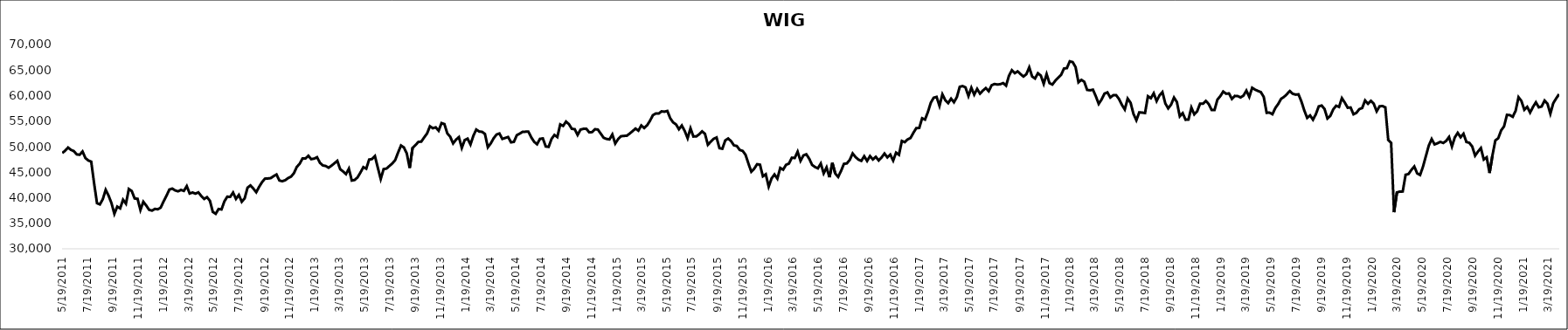
| Category | WIG |
|---|---|
| 5/19/11 | 48747.55 |
| 5/26/11 | 49215.53 |
| 6/2/11 | 49824.93 |
| 6/9/11 | 49378.82 |
| 6/16/11 | 49129.21 |
| 6/23/11 | 48485.26 |
| 6/30/11 | 48414.36 |
| 7/7/11 | 49057.05 |
| 7/14/11 | 47768.38 |
| 7/21/11 | 47291.31 |
| 7/28/11 | 47071.4 |
| 8/4/11 | 42828.22 |
| 8/11/11 | 38934.71 |
| 8/18/11 | 38697.56 |
| 8/25/11 | 39715.27 |
| 9/1/11 | 41553.09 |
| 9/8/11 | 40405.17 |
| 9/15/11 | 38945 |
| 9/22/11 | 36851.2 |
| 9/29/11 | 38264.32 |
| 10/6/11 | 37915.03 |
| 10/13/11 | 39608.13 |
| 10/20/11 | 38835.92 |
| 10/27/11 | 41708.88 |
| 11/3/11 | 41313.92 |
| 11/10/11 | 39853.18 |
| 11/17/11 | 39797.19 |
| 11/24/11 | 37607.27 |
| 12/1/11 | 39215.21 |
| 12/8/11 | 38474.28 |
| 12/15/11 | 37637.47 |
| 12/22/11 | 37478.7 |
| 12/29/11 | 37814.52 |
| 1/5/12 | 37739.39 |
| 1/12/12 | 38062.87 |
| 1/19/12 | 39288.13 |
| 1/26/12 | 40392.48 |
| 2/2/12 | 41602.24 |
| 2/9/12 | 41792.46 |
| 2/16/12 | 41430.3 |
| 2/23/12 | 41258.14 |
| 3/1/12 | 41533.87 |
| 3/8/12 | 41337.97 |
| 3/15/12 | 42281.33 |
| 3/22/12 | 40834.43 |
| 3/29/12 | 41028.06 |
| 4/5/12 | 40802.41 |
| 4/12/12 | 41053.82 |
| 4/19/12 | 40354.53 |
| 4/26/12 | 39761.78 |
| 5/3/12 | 40114.73 |
| 5/10/12 | 39404.16 |
| 5/17/12 | 37228.88 |
| 5/24/12 | 36852.75 |
| 5/31/12 | 37793.58 |
| 6/7/12 | 37707.25 |
| 6/14/12 | 39286.64 |
| 6/21/12 | 40207.61 |
| 6/28/12 | 40165.34 |
| 7/5/12 | 41013.96 |
| 7/12/12 | 39778.1 |
| 7/19/12 | 40545.64 |
| 7/26/12 | 39213.05 |
| 8/2/12 | 39876.95 |
| 8/9/12 | 41976.63 |
| 8/16/12 | 42408.41 |
| 8/23/12 | 41795.63 |
| 8/30/12 | 41077.44 |
| 9/6/12 | 42134.93 |
| 9/13/12 | 43047.41 |
| 9/20/12 | 43737.02 |
| 9/27/12 | 43763.3 |
| 10/4/12 | 43840.23 |
| 10/11/12 | 44224.67 |
| 10/18/12 | 44550.12 |
| 10/25/12 | 43374.6 |
| 11/1/12 | 43232.44 |
| 11/8/12 | 43429.42 |
| 11/15/12 | 43845.94 |
| 11/22/12 | 44121.53 |
| 11/29/12 | 44787.84 |
| 12/6/12 | 46019.97 |
| 12/13/12 | 46653.84 |
| 12/20/12 | 47701.82 |
| 12/27/12 | 47673.03 |
| 1/3/13 | 48222.72 |
| 1/10/13 | 47546.91 |
| 1/17/13 | 47661.37 |
| 1/24/13 | 47942.04 |
| 1/31/13 | 46840.15 |
| 2/7/13 | 46329.66 |
| 2/14/13 | 46211.54 |
| 2/21/13 | 45879.9 |
| 2/28/13 | 46280.36 |
| 3/7/13 | 46745.26 |
| 3/14/13 | 47223.68 |
| 3/21/13 | 45580.47 |
| 3/28/13 | 45147.57 |
| 4/4/13 | 44623.89 |
| 4/11/13 | 45688.48 |
| 4/18/13 | 43364.7 |
| 4/25/13 | 43482.18 |
| 5/2/13 | 43991.51 |
| 5/9/13 | 44943.16 |
| 5/16/13 | 45992.03 |
| 5/23/13 | 45687.76 |
| 5/30/13 | 47476.64 |
| 6/6/13 | 47573.66 |
| 6/13/13 | 48152.82 |
| 6/20/13 | 45870 |
| 6/27/13 | 43667.37 |
| 7/4/13 | 45613.75 |
| 7/11/13 | 45712.72 |
| 7/18/13 | 46221.23 |
| 7/25/13 | 46713.02 |
| 8/1/13 | 47370.81 |
| 8/8/13 | 48862.88 |
| 8/15/13 | 50223.95 |
| 8/22/13 | 49846.48 |
| 8/29/13 | 48676.45 |
| 9/5/13 | 45830.66 |
| 9/12/13 | 49771.55 |
| 9/19/13 | 50300.53 |
| 9/26/13 | 50936.34 |
| 10/3/13 | 50982.03 |
| 10/10/13 | 51806.83 |
| 10/17/13 | 52573.59 |
| 10/24/13 | 53994.46 |
| 10/31/13 | 53607.86 |
| 11/7/13 | 53785.07 |
| 11/14/13 | 53127.16 |
| 11/21/13 | 54621.21 |
| 11/28/13 | 54420.19 |
| 12/5/13 | 52597.13 |
| 12/12/13 | 51947.96 |
| 12/19/13 | 50631.75 |
| 12/26/13 | 51362.3 |
| 1/2/14 | 51865.89 |
| 1/9/14 | 49753.03 |
| 1/16/14 | 51288.7 |
| 1/23/14 | 51569.21 |
| 1/30/14 | 50417.17 |
| 2/6/14 | 52138.87 |
| 2/13/14 | 53349.65 |
| 2/20/14 | 52967.02 |
| 2/27/14 | 52906.04 |
| 3/6/14 | 52487.84 |
| 3/13/14 | 49878.65 |
| 3/20/14 | 50627.71 |
| 3/27/14 | 51642.99 |
| 4/3/14 | 52376.18 |
| 4/10/14 | 52580.73 |
| 4/17/14 | 51510.98 |
| 4/24/14 | 51705.76 |
| 5/1/14 | 51892.77 |
| 5/8/14 | 50851.25 |
| 5/15/14 | 50944.5 |
| 5/22/14 | 52244.13 |
| 5/29/14 | 52553.48 |
| 6/5/14 | 52901.29 |
| 6/12/14 | 52927.91 |
| 6/19/14 | 52937.45 |
| 6/26/14 | 51815.43 |
| 7/3/14 | 50951.73 |
| 7/10/14 | 50474.36 |
| 7/17/14 | 51527.37 |
| 7/24/14 | 51613.47 |
| 7/31/14 | 50037.12 |
| 8/7/14 | 49958.67 |
| 8/14/14 | 51512.57 |
| 8/21/14 | 52294.93 |
| 8/28/14 | 51882.01 |
| 9/4/14 | 54358.49 |
| 9/11/14 | 54065.27 |
| 9/18/14 | 54906.1 |
| 9/25/14 | 54411.77 |
| 10/2/14 | 53498.77 |
| 10/9/14 | 53416.03 |
| 10/16/14 | 52297.79 |
| 10/23/14 | 53335.43 |
| 10/30/14 | 53492 |
| 11/6/14 | 53512.14 |
| 11/13/14 | 52816.35 |
| 11/20/14 | 52848.54 |
| 11/27/14 | 53415.63 |
| 12/4/14 | 53346.86 |
| 12/11/14 | 52550.03 |
| 12/18/14 | 51739.04 |
| 12/25/14 | 51511.68 |
| 1/1/15 | 51416.08 |
| 1/8/15 | 52391 |
| 1/15/15 | 50616.63 |
| 1/22/15 | 51484.81 |
| 1/29/15 | 52040.24 |
| 2/5/15 | 52107.26 |
| 2/12/15 | 52139.81 |
| 2/19/15 | 52572.95 |
| 2/26/15 | 53042.6 |
| 3/5/15 | 53546.4 |
| 3/12/15 | 53136.13 |
| 3/19/15 | 54148.48 |
| 3/26/15 | 53649.9 |
| 4/2/15 | 54179.04 |
| 4/9/15 | 55063.85 |
| 4/16/15 | 56165.1 |
| 4/23/15 | 56492.95 |
| 4/30/15 | 56477.69 |
| 5/7/15 | 56911.34 |
| 5/14/15 | 56845.83 |
| 5/21/15 | 56990.6 |
| 5/28/15 | 55556.13 |
| 6/4/15 | 54749.74 |
| 6/11/15 | 54357.69 |
| 6/18/15 | 53408.53 |
| 6/25/15 | 54141.2 |
| 7/2/15 | 53074.71 |
| 7/9/15 | 51658.71 |
| 7/16/15 | 53588.24 |
| 7/23/15 | 51986.22 |
| 7/30/15 | 52011.81 |
| 8/6/15 | 52418.07 |
| 8/13/15 | 52995.96 |
| 8/20/15 | 52508.32 |
| 8/27/15 | 50366.09 |
| 9/3/15 | 50977.06 |
| 9/10/15 | 51527.08 |
| 9/17/15 | 51801.58 |
| 9/24/15 | 49701.31 |
| 10/1/15 | 49593.95 |
| 10/8/15 | 51222.77 |
| 10/15/15 | 51599.62 |
| 10/22/15 | 51094.29 |
| 10/29/15 | 50262.68 |
| 11/5/15 | 50125.85 |
| 11/12/15 | 49358.2 |
| 11/19/15 | 49177.74 |
| 11/26/15 | 48418.14 |
| 12/3/15 | 46693.09 |
| 12/10/15 | 45093.65 |
| 12/17/15 | 45684.05 |
| 12/24/15 | 46564.08 |
| 12/31/15 | 46467.38 |
| 1/7/16 | 44195.91 |
| 1/14/16 | 44596.08 |
| 1/21/16 | 42180.3 |
| 1/28/16 | 43778.96 |
| 2/4/16 | 44557.64 |
| 2/11/16 | 43741.96 |
| 2/18/16 | 45834.88 |
| 2/25/16 | 45497.77 |
| 3/3/16 | 46448.27 |
| 3/10/16 | 46686.74 |
| 3/17/16 | 47833.39 |
| 3/24/16 | 47778.01 |
| 3/31/16 | 49017.35 |
| 4/7/16 | 47231.36 |
| 4/14/16 | 48285.21 |
| 4/21/16 | 48514.39 |
| 4/28/16 | 47643.7 |
| 5/5/16 | 46430.16 |
| 5/12/16 | 46022.02 |
| 5/19/16 | 45751.68 |
| 5/26/16 | 46695.37 |
| 6/2/16 | 44772.72 |
| 6/9/16 | 45940.12 |
| 6/16/16 | 44007.81 |
| 6/23/16 | 46826.85 |
| 6/30/16 | 44748.53 |
| 7/7/16 | 44077.16 |
| 7/14/16 | 45246.26 |
| 7/21/16 | 46639.17 |
| 7/28/16 | 46718.98 |
| 8/4/16 | 47407.09 |
| 8/11/16 | 48675.96 |
| 8/18/16 | 47967.07 |
| 8/25/16 | 47464.07 |
| 9/1/16 | 47221.32 |
| 9/8/16 | 48129.15 |
| 9/15/16 | 47198.39 |
| 9/22/16 | 48154.88 |
| 9/29/16 | 47494.62 |
| 10/6/16 | 48014.44 |
| 10/13/16 | 47303.15 |
| 10/20/16 | 47894.17 |
| 10/27/16 | 48651.28 |
| 11/3/16 | 47899.61 |
| 11/10/16 | 48447.59 |
| 11/17/16 | 47274.21 |
| 11/24/16 | 48824.83 |
| 12/1/16 | 48404.21 |
| 12/8/16 | 51123.43 |
| 12/15/16 | 50881.35 |
| 12/22/16 | 51423.71 |
| 12/29/16 | 51703.91 |
| 1/5/17 | 52721.67 |
| 1/12/17 | 53650.94 |
| 1/19/17 | 53654.99 |
| 1/26/17 | 55560.23 |
| 2/2/17 | 55303.11 |
| 2/9/17 | 56785.52 |
| 2/16/17 | 58610.28 |
| 2/23/17 | 59583.89 |
| 3/2/17 | 59743.64 |
| 3/9/17 | 57986.6 |
| 3/16/17 | 60247.18 |
| 3/23/17 | 59093.68 |
| 3/30/17 | 58527.2 |
| 4/6/17 | 59406.36 |
| 4/13/17 | 58695.36 |
| 4/20/17 | 59700.07 |
| 4/27/17 | 61731.8 |
| 5/4/17 | 61862.8 |
| 5/11/17 | 61598.78 |
| 5/18/17 | 59901.12 |
| 5/25/17 | 61536.22 |
| 6/1/17 | 60181.96 |
| 6/8/17 | 61312.68 |
| 6/15/17 | 60381.07 |
| 6/22/17 | 60987.33 |
| 6/29/17 | 61475.96 |
| 7/6/17 | 60869.83 |
| 7/13/17 | 62018.68 |
| 7/20/17 | 62269.72 |
| 7/27/17 | 62171.7 |
| 8/3/17 | 62231.08 |
| 8/10/17 | 62451.57 |
| 8/17/17 | 61949.4 |
| 8/24/17 | 63886.54 |
| 8/31/17 | 64973.76 |
| 9/7/17 | 64381.87 |
| 9/14/17 | 64748.47 |
| 9/21/17 | 64209.19 |
| 9/28/17 | 63729.77 |
| 10/5/17 | 64185.71 |
| 10/12/17 | 65529.1 |
| 10/19/17 | 63745 |
| 10/26/17 | 63342.71 |
| 11/2/17 | 64375.83 |
| 11/9/17 | 63923.62 |
| 11/16/17 | 62299.29 |
| 11/23/17 | 64207.77 |
| 11/30/17 | 62440.31 |
| 12/7/17 | 62164.65 |
| 12/14/17 | 62916.39 |
| 12/21/17 | 63477.25 |
| 12/28/17 | 64053.47 |
| 1/4/18 | 65297.96 |
| 1/11/18 | 65379.88 |
| 1/18/18 | 66709.12 |
| 1/25/18 | 66561.79 |
| 2/1/18 | 65585.79 |
| 2/8/18 | 62604.89 |
| 2/15/18 | 63078.16 |
| 2/22/18 | 62717.27 |
| 3/1/18 | 61116.96 |
| 3/8/18 | 61036.99 |
| 3/15/18 | 61156.91 |
| 3/22/18 | 59862.55 |
| 3/29/18 | 58377.42 |
| 4/5/18 | 59244.04 |
| 4/12/18 | 60393.23 |
| 4/19/18 | 60629.81 |
| 4/26/18 | 59628.04 |
| 5/3/18 | 60066.46 |
| 5/10/18 | 60091.26 |
| 5/17/18 | 59337.27 |
| 5/24/18 | 58189.49 |
| 5/31/18 | 57282.73 |
| 6/7/18 | 59412.76 |
| 6/14/18 | 58603.93 |
| 6/21/18 | 56425.25 |
| 6/28/18 | 55169.77 |
| 7/5/18 | 56719.88 |
| 7/12/18 | 56671.44 |
| 7/19/18 | 56585.5 |
| 7/26/18 | 59871.2 |
| 8/2/18 | 59484.35 |
| 8/9/18 | 60455.75 |
| 8/16/18 | 58921.44 |
| 8/23/18 | 60044.45 |
| 8/30/18 | 60690.32 |
| 9/6/18 | 58469.6 |
| 9/13/18 | 57493.38 |
| 9/20/18 | 58231.57 |
| 9/27/18 | 59616.27 |
| 10/4/18 | 58736.08 |
| 10/11/18 | 55941.06 |
| 10/18/18 | 56560.93 |
| 10/25/18 | 55271.63 |
| 11/1/18 | 55312.71 |
| 11/8/18 | 57655.73 |
| 11/15/18 | 56329.01 |
| 11/22/18 | 56932.62 |
| 11/29/18 | 58412.94 |
| 12/6/18 | 58409.09 |
| 12/13/18 | 58952.55 |
| 12/20/18 | 58349.03 |
| 12/27/18 | 57183.28 |
| 1/3/19 | 57192.42 |
| 1/10/19 | 59219.23 |
| 1/17/19 | 59894.9 |
| 1/24/19 | 60791.02 |
| 1/31/19 | 60367.42 |
| 2/7/19 | 60422.38 |
| 2/14/19 | 59348.4 |
| 2/21/19 | 59938.07 |
| 2/28/19 | 59903.7 |
| 3/7/19 | 59638.3 |
| 3/14/19 | 60002.72 |
| 3/21/19 | 60976.51 |
| 3/28/19 | 59752.66 |
| 4/4/19 | 61533.27 |
| 4/11/19 | 61168.92 |
| 4/18/19 | 60910.11 |
| 4/25/19 | 60680.62 |
| 5/2/19 | 59744.3 |
| 5/9/19 | 56637.25 |
| 5/16/19 | 56664.5 |
| 5/23/19 | 56351.13 |
| 5/30/19 | 57566.83 |
| 6/6/19 | 58360.5 |
| 6/13/19 | 59374.38 |
| 6/20/19 | 59738.56 |
| 6/27/19 | 60293.37 |
| 7/4/19 | 60888.98 |
| 7/11/19 | 60362.11 |
| 7/18/19 | 60192.6 |
| 7/25/19 | 60249.72 |
| 8/1/19 | 58863.73 |
| 8/8/19 | 57102.69 |
| 8/15/19 | 55634.7 |
| 8/22/19 | 56118.92 |
| 8/29/19 | 55273.05 |
| 9/5/19 | 56358.3 |
| 9/12/19 | 57886.6 |
| 9/19/19 | 58053.03 |
| 9/26/19 | 57377.87 |
| 10/3/19 | 55523.06 |
| 10/10/19 | 56034.97 |
| 10/17/19 | 57297.12 |
| 10/24/19 | 58012.97 |
| 10/31/19 | 57783.02 |
| 11/7/19 | 59492.22 |
| 11/14/19 | 58622.1 |
| 11/21/19 | 57618.54 |
| 11/28/19 | 57669.94 |
| 12/5/19 | 56338.75 |
| 12/12/19 | 56621.06 |
| 12/19/19 | 57346.95 |
| 12/26/19 | 57569.71 |
| 1/2/20 | 59048.28 |
| 1/9/20 | 58397.17 |
| 1/16/20 | 58962.37 |
| 1/23/20 | 58401.85 |
| 1/30/20 | 56923.36 |
| 2/6/20 | 57900.04 |
| 2/13/20 | 57960.23 |
| 2/20/20 | 57693.12 |
| 2/27/20 | 51318.69 |
| 3/5/20 | 50753.91 |
| 3/12/20 | 37164.02 |
| 3/19/20 | 41041.92 |
| 3/26/20 | 41202.98 |
| 4/2/20 | 41219.51 |
| 4/9/20 | 44499.23 |
| 4/16/20 | 44645.12 |
| 4/23/20 | 45450.43 |
| 4/30/20 | 46117 |
| 5/7/20 | 44769.05 |
| 5/14/20 | 44450.71 |
| 5/21/20 | 46073.39 |
| 5/28/20 | 48144.34 |
| 6/4/20 | 50202.54 |
| 6/11/20 | 51486.94 |
| 6/18/20 | 50445.13 |
| 6/25/20 | 50658.89 |
| 7/2/20 | 50937.18 |
| 7/9/20 | 50726.22 |
| 7/16/20 | 51121.23 |
| 7/23/20 | 51890.42 |
| 7/30/20 | 50024.63 |
| 8/6/20 | 51816.87 |
| 8/13/20 | 52706.25 |
| 8/20/20 | 51842.65 |
| 8/27/20 | 52528.67 |
| 9/3/20 | 50915.67 |
| 9/10/20 | 50757.07 |
| 9/17/20 | 50035.54 |
| 9/24/20 | 48241.11 |
| 10/1/20 | 49035.41 |
| 10/8/20 | 49727.34 |
| 10/15/20 | 47482 |
| 10/22/20 | 47910.38 |
| 10/29/20 | 44840.6 |
| 11/5/20 | 48295.31 |
| 11/12/20 | 51229.23 |
| 11/19/20 | 51651.4 |
| 11/26/20 | 53187.31 |
| 12/3/20 | 53967.82 |
| 12/10/20 | 56230.4 |
| 12/17/20 | 56176.07 |
| 12/24/20 | 55843.46 |
| 12/31/20 | 57025.84 |
| 1/7/21 | 59687.54 |
| 1/14/21 | 58945.17 |
| 1/21/21 | 57226.74 |
| 1/28/21 | 57797.95 |
| 2/4/21 | 56669.86 |
| 2/11/21 | 57790.5 |
| 2/18/21 | 58684.46 |
| 2/25/21 | 57706.4 |
| 3/4/21 | 57869.71 |
| 3/11/21 | 59028.6 |
| 3/18/21 | 58405.96 |
| 3/25/21 | 56448.66 |
| 4/1/21 | 58512.71 |
| 4/8/21 | 59435.58 |
| 4/15/21 | 60279 |